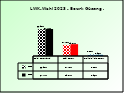
| Category | 2018 | 2023 |
|---|---|---|
| Bgld. Bauernbund | 0.669 | 0.675 |
| SPÖ Bauern | 0.277 | 0.296 |
| Freiheitliche Bauern | 0.038 | 0.03 |